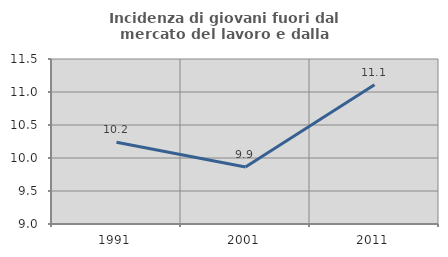
| Category | Incidenza di giovani fuori dal mercato del lavoro e dalla formazione  |
|---|---|
| 1991.0 | 10.238 |
| 2001.0 | 9.863 |
| 2011.0 | 11.111 |